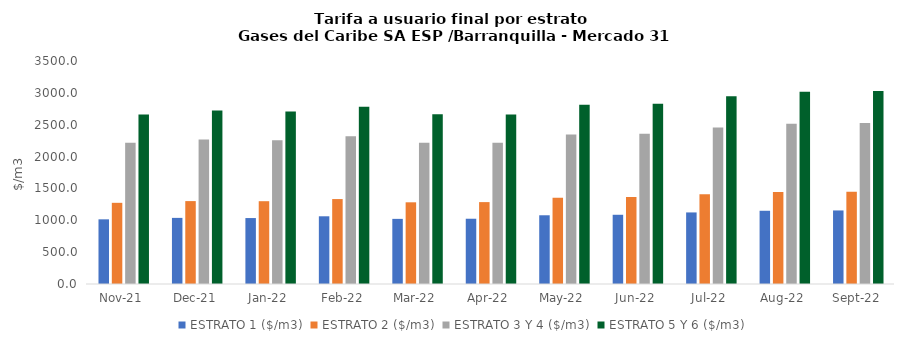
| Category | ESTRATO 1 ($/m3) | ESTRATO 2 ($/m3) | ESTRATO 3 Y 4 ($/m3) | ESTRATO 5 Y 6 ($/m3) |
|---|---|---|---|---|
| 2021-11-01 | 1015 | 1274.13 | 2217.49 | 2660.988 |
| 2021-12-01 | 1037.76 | 1301.16 | 2269.54 | 2723.448 |
| 2022-01-01 | 1034.96 | 1299.58 | 2255.09 | 2706.108 |
| 2022-02-01 | 1062.79 | 1333.18 | 2319.47 | 2783.364 |
| 2022-03-01 | 1022.16 | 1282.17 | 2218.76 | 2662.512 |
| 2022-04-01 | 1024.32 | 1285.33 | 2218.09 | 2661.708 |
| 2022-05-01 | 1078.73 | 1354.26 | 2345.47 | 2814.564 |
| 2022-06-01 | 1086.51 | 1364.12 | 2359 | 2830.8 |
| 2022-07-01 | 1123.27 | 1408.66 | 2455.61 | 2946.732 |
| 2022-08-01 | 1149.36 | 1442.77 | 2514.15 | 3016.98 |
| 2022-09-01 | 1154.32 | 1447.01 | 2525.28 | 3030.336 |